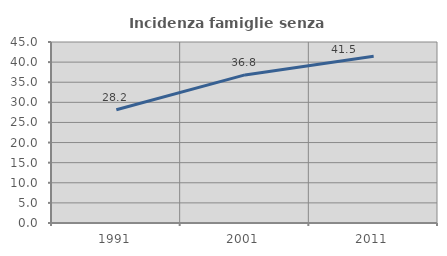
| Category | Incidenza famiglie senza nuclei |
|---|---|
| 1991.0 | 28.167 |
| 2001.0 | 36.823 |
| 2011.0 | 41.457 |